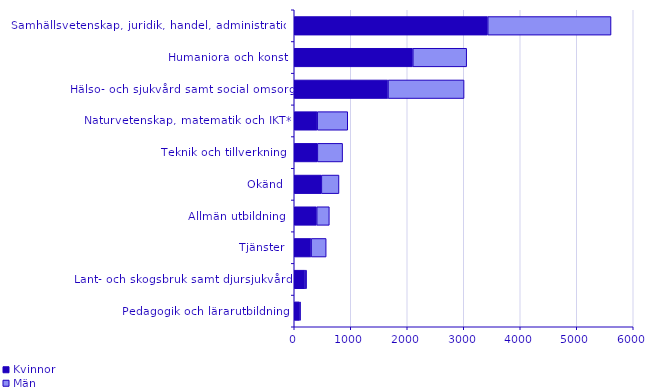
| Category | Kvinnor | Män |
|---|---|---|
| Pedagogik och lärarutbildning | 93 | 19 |
| Lant- och skogsbruk samt djursjukvård | 192 | 27 |
| Tjänster | 298 | 267 |
| Allmän utbildning | 397 | 224 |
| Okänd | 480 | 312 |
| Teknik och tillverkning | 409 | 447 |
| Naturvetenskap, matematik och IKT* | 406 | 541 |
| Hälso- och sjukvård samt social omsorg | 1659 | 1347 |
| Humaniora och konst | 2098 | 954 |
| Samhällsvetenskap, juridik, handel, administration | 3424 | 2183 |